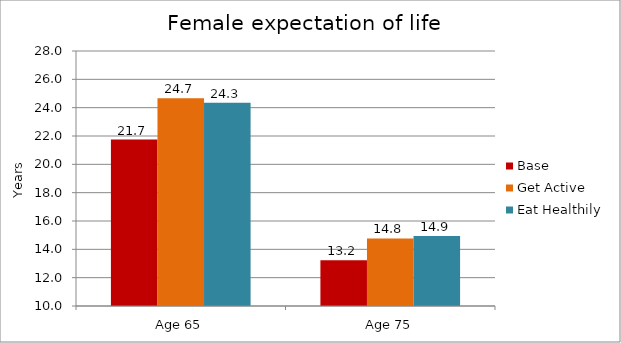
| Category | Base | Get Active | Eat Healthily |
|---|---|---|---|
| Age 65 | 21.748 | 24.672 | 24.348 |
| Age 75 | 13.223 | 14.773 | 14.939 |